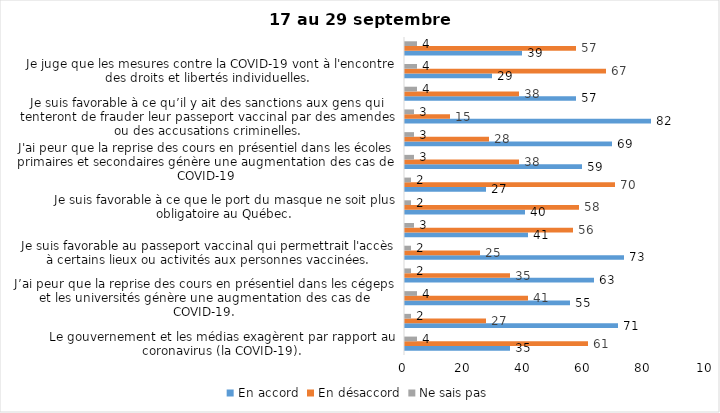
| Category | En accord | En désaccord | Ne sais pas |
|---|---|---|---|
| Le gouvernement et les médias exagèrent par rapport au coronavirus (la COVID-19). | 35 | 61 | 4 |
| J’ai peur que le système de santé soit débordé par les cas de COVID-19. | 71 | 27 | 2 |
| J’ai peur que la reprise des cours en présentiel dans les cégeps et les universités génère une augmentation des cas de COVID-19. | 55 | 41 | 4 |
| Je suis inquiet/inquiète  que le nombre de cas augmente en raison des nouveaux variants du virus de la COVID-19 | 63 | 35 | 2 |
| Je suis favorable au passeport vaccinal qui permettrait l'accès à certains lieux ou activités aux personnes vaccinées. | 73 | 25 | 2 |
| Si les cas de COVID-19 augmentent cet automne, je suis favorable à la mise en place de mesures de confinement (ex. fermeture de services non essentiels, interdiction des rassemblements privés) | 41 | 56 | 3 |
| Je suis favorable à ce que le port du masque ne soit plus obligatoire au Québec. | 40 | 58 | 2 |
| Étant donné la progression de la vaccination, je pense qu’il est moins important de suivre les mesures de prévention. | 27 | 70 | 2 |
| J'ai peur que la reprise des cours en présentiel dans les écoles primaires et secondaires génère une augmentation des cas de COVID-19 | 59 | 38 | 3 |
| Je suis favorable à ce qu’il y ait des sanctions aux commerçants qui ne vérifieront pas le passeport vaccinal (code QR) de leurs clients | 69 | 28 | 3 |
| Je suis favorable à ce qu’il y ait des sanctions aux gens qui tenteront de frauder leur passeport vaccinal par des amendes ou des accusations criminelles. | 82 | 15 | 3 |
| Je crois que le passeport vaccinal devrait être requis pour davantage de services et commerces (ex. : spas, centre d’achats, centre de soins personnels. | 57 | 38 | 4 |
| Je juge que les mesures contre la COVID-19 vont à l'encontre des droits et libertés individuelles.  | 29 | 67 | 4 |
| Je pense que le gouvernement du Québec devrait mettre fin à l’état d’urgence sanitaire.  | 39 | 57 | 4 |